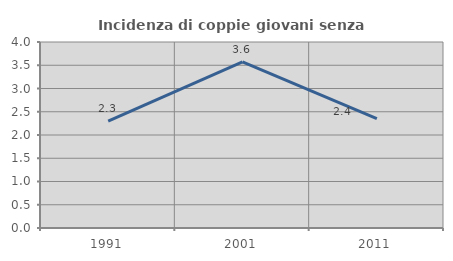
| Category | Incidenza di coppie giovani senza figli |
|---|---|
| 1991.0 | 2.299 |
| 2001.0 | 3.571 |
| 2011.0 | 2.353 |